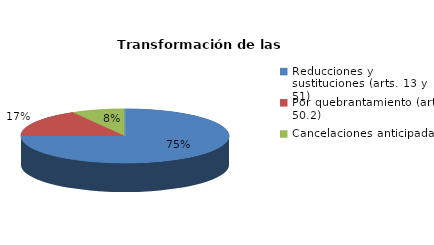
| Category | Series 0 |
|---|---|
| Reducciones y sustituciones (arts. 13 y 51) | 9 |
| Por quebrantamiento (art. 50.2) | 2 |
| Cancelaciones anticipadas | 1 |
| Traslado a Centros Penitenciarios | 0 |
| Conversión internamientos en cerrados (art. 51.2) | 0 |